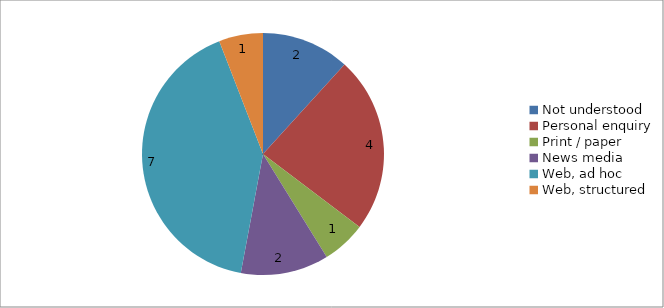
| Category | Series 0 |
|---|---|
| Not understood | 2 |
| Personal enquiry | 4 |
| Print / paper | 1 |
| News media | 2 |
| Web, ad hoc | 7 |
| Web, structured | 1 |